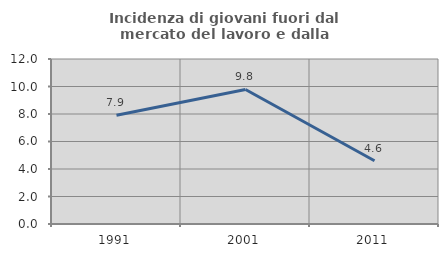
| Category | Incidenza di giovani fuori dal mercato del lavoro e dalla formazione  |
|---|---|
| 1991.0 | 7.909 |
| 2001.0 | 9.783 |
| 2011.0 | 4.598 |